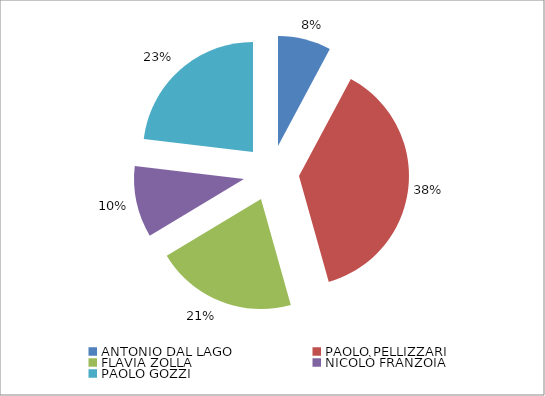
| Category | Liste |
|---|---|
| ANTONIO DAL LAGO | 391 |
| PAOLO PELLIZZARI | 1894 |
| FLAVIA ZOLLA | 1039 |
| NICOLÒ FRANZOIA | 525 |
| PAOLO GOZZI | 1158 |